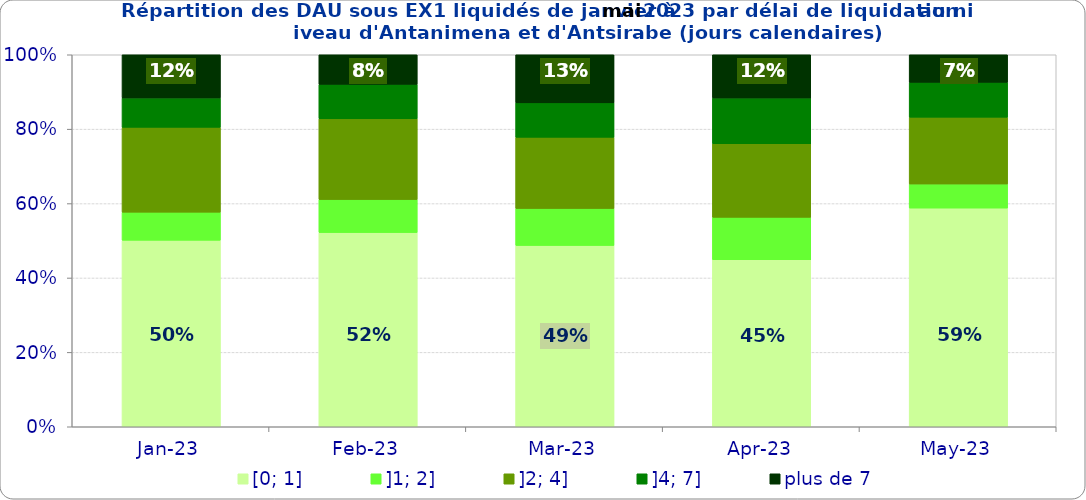
| Category | [0; 1] | ]1; 2] | ]2; 4] | ]4; 7] | plus de 7 |
|---|---|---|---|---|---|
| 2023-01-01 | 0.501 | 0.076 | 0.228 | 0.079 | 0.116 |
| 2023-02-01 | 0.522 | 0.089 | 0.217 | 0.093 | 0.08 |
| 2023-03-01 | 0.487 | 0.1 | 0.191 | 0.092 | 0.129 |
| 2023-04-01 | 0.449 | 0.114 | 0.198 | 0.123 | 0.116 |
| 2023-05-01 | 0.588 | 0.065 | 0.18 | 0.094 | 0.074 |